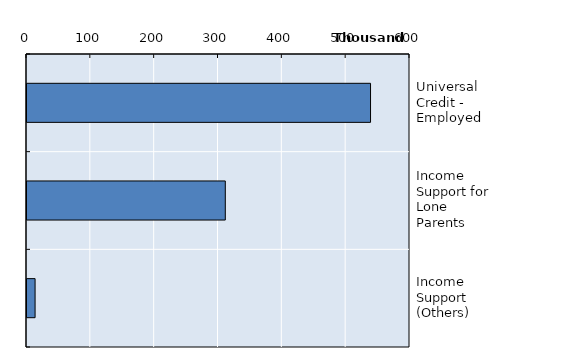
| Category | Series 0 |
|---|---|
| Universal Credit - Employed | 538174 |
| Income Support for Lone Parents | 310670 |
| Income Support (Others) | 12670 |